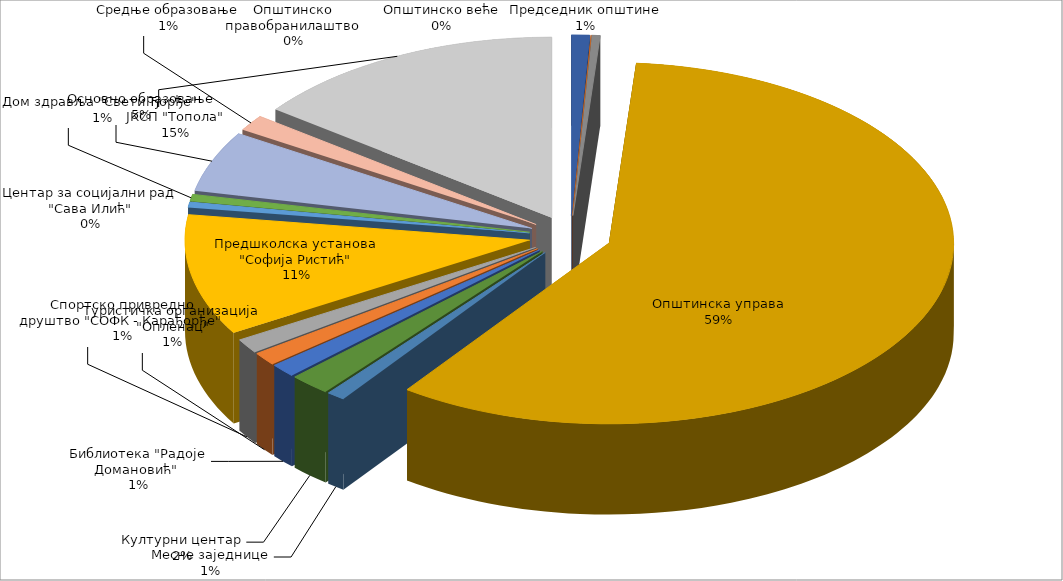
| Category | Series 0 |
|---|---|
| Председник општине | 5301000 |
| Општинско веће | 143000 |
| Општинско правобранилаштво | 2409000 |
| Општинска управа | 366153000 |
| Месне заједнице | 5400000 |
| Културни центар | 12054000 |
| Библиотека "Радоје Домановић"  | 7526000 |
| Туристичка организација "Опленац" | 7378000 |
| Спортско привредно друштво "СОФК - Карађорђе" | 8091000 |
| Предшколска установа "Софија Ристић" | 67501000 |
| Центар за социјални рад "Сава Илић" | 2983000 |
| Дом здравља "Свети Ђорђе" | 3907000 |
| Основно образовање | 33902000 |
| Средње образовање | 8884000 |
| ЈКСП "Топола" | 92211000 |